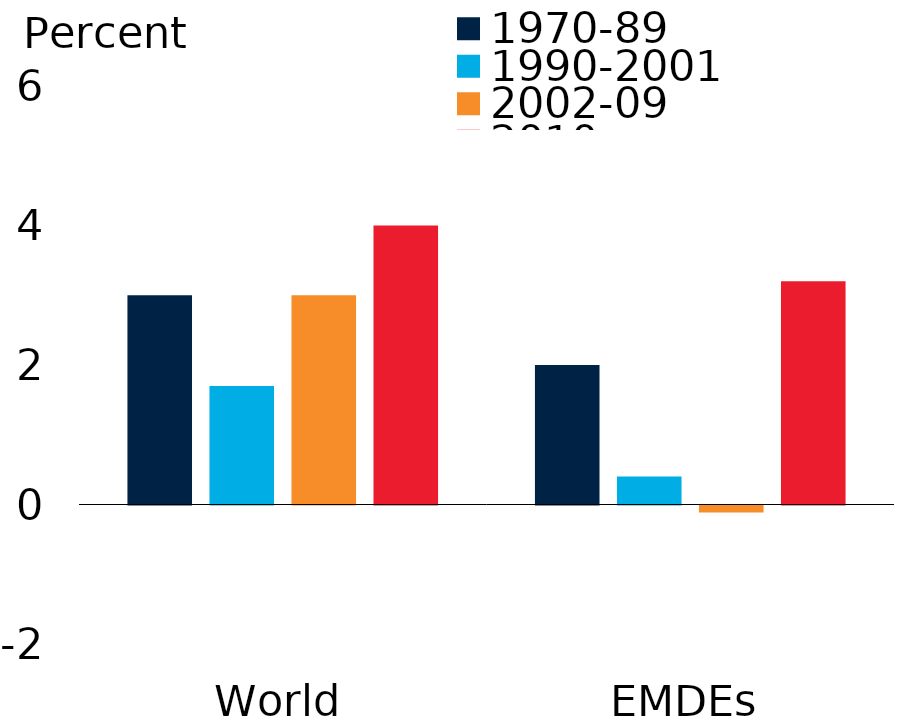
| Category | 1970-89 | 1990-2001 | 2002-09 | 2010-now |
|---|---|---|---|---|
| World | 3 | 1.7 | 3 | 4 |
| EMDEs | 2 | 0.4 | -0.1 | 3.2 |